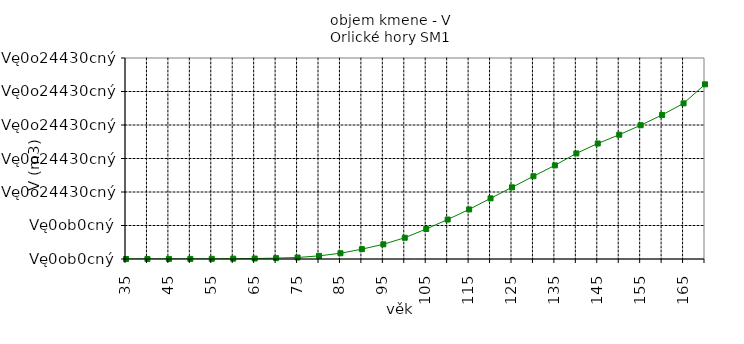
| Category | V |
|---|---|
| 35.0 | 0 |
| 40.0 | 0.001 |
| 45.0 | 0.001 |
| 50.0 | 0.002 |
| 55.0 | 0.003 |
| 60.0 | 0.005 |
| 65.0 | 0.007 |
| 70.0 | 0.013 |
| 75.0 | 0.022 |
| 80.0 | 0.047 |
| 85.0 | 0.086 |
| 90.0 | 0.147 |
| 95.0 | 0.219 |
| 100.0 | 0.317 |
| 105.0 | 0.448 |
| 110.0 | 0.589 |
| 115.0 | 0.74 |
| 120.0 | 0.905 |
| 125.0 | 1.07 |
| 130.0 | 1.235 |
| 135.0 | 1.398 |
| 140.0 | 1.576 |
| 145.0 | 1.724 |
| 150.0 | 1.855 |
| 155.0 | 1.996 |
| 160.0 | 2.15 |
| 165.0 | 2.323 |
| 170.0 | 2.607 |